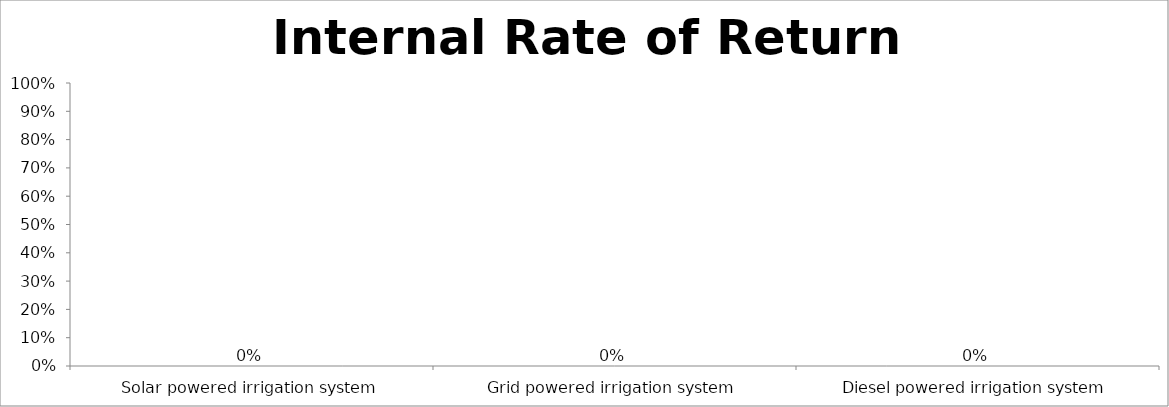
| Category | Series 0 |
|---|---|
| Solar powered irrigation system | 0 |
| Grid powered irrigation system | 0 |
| Diesel powered irrigation system | 0 |